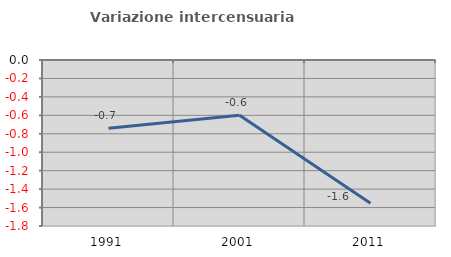
| Category | Variazione intercensuaria annua |
|---|---|
| 1991.0 | -0.74 |
| 2001.0 | -0.598 |
| 2011.0 | -1.554 |